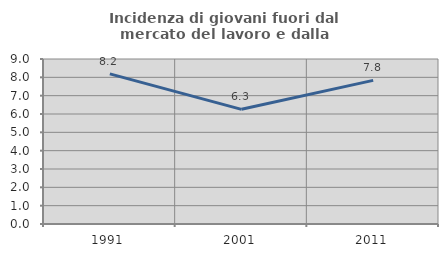
| Category | Incidenza di giovani fuori dal mercato del lavoro e dalla formazione  |
|---|---|
| 1991.0 | 8.191 |
| 2001.0 | 6.254 |
| 2011.0 | 7.833 |